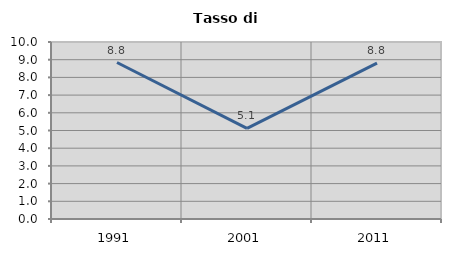
| Category | Tasso di disoccupazione   |
|---|---|
| 1991.0 | 8.842 |
| 2001.0 | 5.12 |
| 2011.0 | 8.804 |